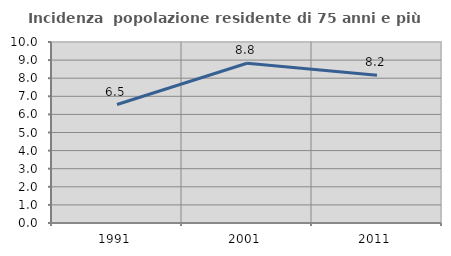
| Category | Incidenza  popolazione residente di 75 anni e più |
|---|---|
| 1991.0 | 6.545 |
| 2001.0 | 8.827 |
| 2011.0 | 8.164 |